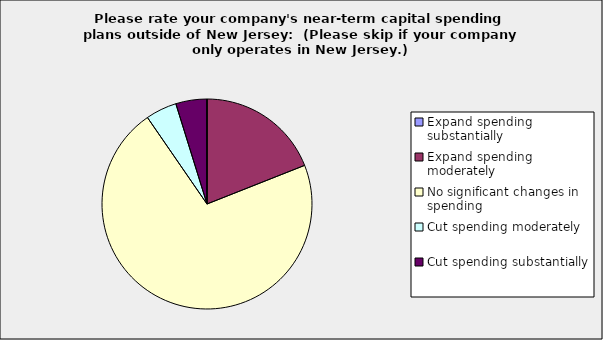
| Category | Series 0 |
|---|---|
| Expand spending substantially | 0 |
| Expand spending moderately | 0.19 |
| No significant changes in spending | 0.714 |
| Cut spending moderately | 0.048 |
| Cut spending substantially | 0.048 |